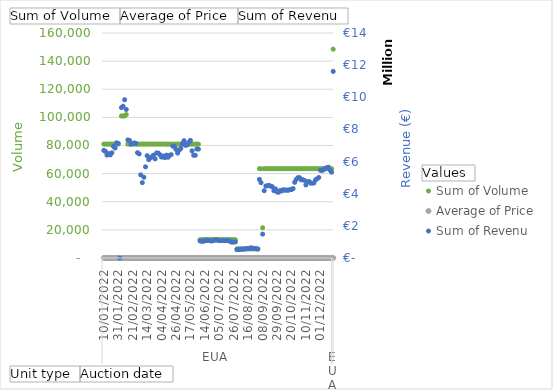
| Category | Sum of Volume |
|---|---|
| 0 | 81000 |
| 1 | 81000 |
| 2 | 81000 |
| 3 | 81000 |
| 4 | 81000 |
| 5 | 81000 |
| 6 | 81000 |
| 7 | 81000 |
| 8 | 81000 |
| 9 | 81000 |
| 10 | 0 |
| 11 | 101000 |
| 12 | 101000 |
| 13 | 101000 |
| 14 | 102000 |
| 15 | 81000 |
| 16 | 81000 |
| 17 | 81000 |
| 18 | 81000 |
| 19 | 81000 |
| 20 | 81000 |
| 21 | 81000 |
| 22 | 81000 |
| 23 | 81000 |
| 24 | 81000 |
| 25 | 81000 |
| 26 | 81000 |
| 27 | 81000 |
| 28 | 81000 |
| 29 | 81000 |
| 30 | 81000 |
| 31 | 81000 |
| 32 | 81000 |
| 33 | 81000 |
| 34 | 81000 |
| 35 | 81000 |
| 36 | 81000 |
| 37 | 81000 |
| 38 | 81000 |
| 39 | 81000 |
| 40 | 81000 |
| 41 | 81000 |
| 42 | 81000 |
| 43 | 81000 |
| 44 | 81000 |
| 45 | 81000 |
| 46 | 81000 |
| 47 | 81000 |
| 48 | 81000 |
| 49 | 81000 |
| 50 | 81000 |
| 51 | 81000 |
| 52 | 81000 |
| 53 | 81000 |
| 54 | 81000 |
| 55 | 81000 |
| 56 | 81000 |
| 57 | 81000 |
| 58 | 81000 |
| 59 | 81000 |
| 60 | 13000 |
| 61 | 13000 |
| 62 | 13000 |
| 63 | 13000 |
| 64 | 13000 |
| 65 | 13000 |
| 66 | 13000 |
| 67 | 13000 |
| 68 | 13000 |
| 69 | 13000 |
| 70 | 13000 |
| 71 | 13000 |
| 72 | 13000 |
| 73 | 13000 |
| 74 | 13000 |
| 75 | 13000 |
| 76 | 13000 |
| 77 | 13000 |
| 78 | 13000 |
| 79 | 13000 |
| 80 | 13000 |
| 81 | 13000 |
| 82 | 13000 |
| 83 | 6500 |
| 84 | 6500 |
| 85 | 6500 |
| 86 | 6500 |
| 87 | 6500 |
| 88 | 6500 |
| 89 | 6500 |
| 90 | 6500 |
| 91 | 6500 |
| 92 | 6500 |
| 93 | 6500 |
| 94 | 6500 |
| 95 | 6500 |
| 96 | 6500 |
| 97 | 63500 |
| 98 | 63500 |
| 99 | 21500 |
| 100 | 63500 |
| 101 | 63500 |
| 102 | 63500 |
| 103 | 63500 |
| 104 | 63500 |
| 105 | 63500 |
| 106 | 63500 |
| 107 | 63500 |
| 108 | 63500 |
| 109 | 63500 |
| 110 | 63500 |
| 111 | 63500 |
| 112 | 63500 |
| 113 | 63500 |
| 114 | 63500 |
| 115 | 63500 |
| 116 | 63500 |
| 117 | 63500 |
| 118 | 63500 |
| 119 | 63500 |
| 120 | 63500 |
| 121 | 63500 |
| 122 | 63500 |
| 123 | 63500 |
| 124 | 63500 |
| 125 | 63500 |
| 126 | 63500 |
| 127 | 63500 |
| 128 | 63500 |
| 129 | 63500 |
| 130 | 63500 |
| 131 | 63500 |
| 132 | 63500 |
| 133 | 63500 |
| 134 | 63500 |
| 135 | 63500 |
| 136 | 63500 |
| 137 | 63500 |
| 138 | 63500 |
| 139 | 63500 |
| 140 | 63500 |
| 141 | 63500 |
| 142 | 63500 |
| 143 | 148500 |